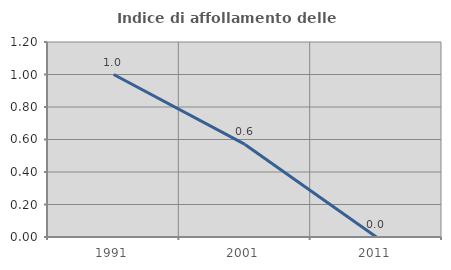
| Category | Indice di affollamento delle abitazioni  |
|---|---|
| 1991.0 | 1 |
| 2001.0 | 0.57 |
| 2011.0 | 0 |